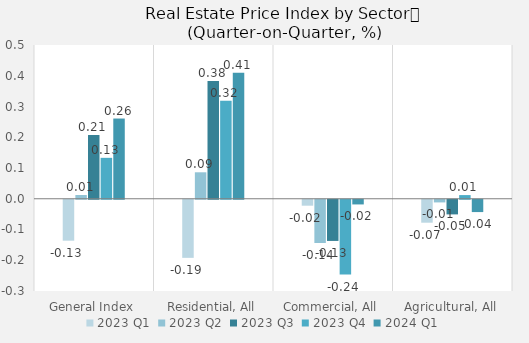
| Category | 2023 | 2024 |
|---|---|---|
| General Index | 0.133 | 0.261 |
| Residential, All | 0.319 | 0.41 |
| Commercial, All | -0.243 | -0.015 |
| Agricultural, All | 0.012 | -0.04 |